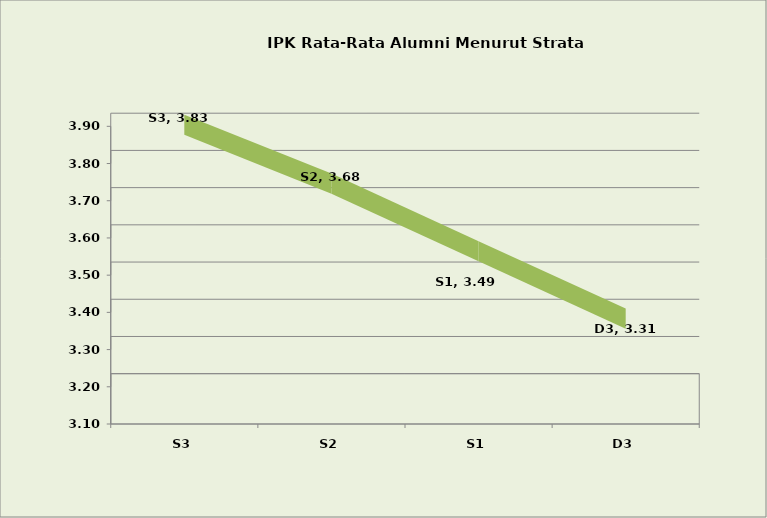
| Category | Series 0 |
|---|---|
| S3 | 3.834 |
| S2 | 3.676 |
| S1 | 3.495 |
| D3 | 3.313 |